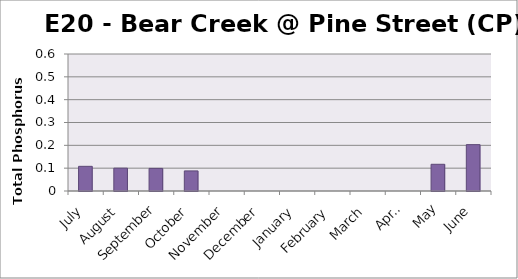
| Category | Phosphorus (mg/L) |
|---|---|
| July | 0.108 |
| August | 0.1 |
| September | 0.099 |
| October | 0.088 |
| November | 0 |
| December | 0 |
| January | 0 |
| February | 0 |
| March | 0 |
| April | 0 |
| May | 0.117 |
| June | 0.203 |